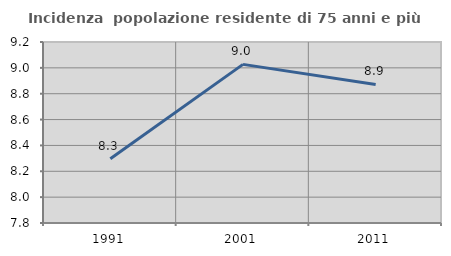
| Category | Incidenza  popolazione residente di 75 anni e più |
|---|---|
| 1991.0 | 8.297 |
| 2001.0 | 9.027 |
| 2011.0 | 8.872 |